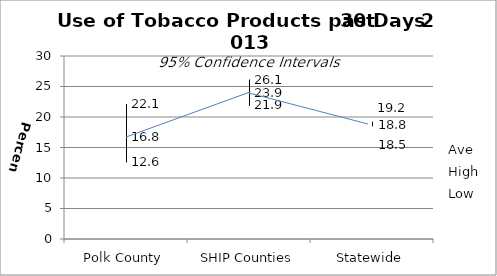
| Category | Ave | High | Low |
|---|---|---|---|
| Polk County | 16.8 | 22.1 | 12.6 |
| SHIP Counties | 23.9 | 26.1 | 21.9 |
| Statewide | 18.8 | 19.2 | 18.5 |